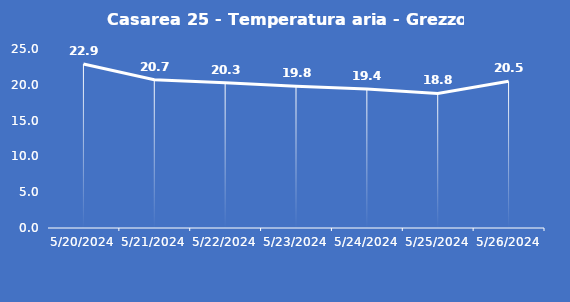
| Category | Casarea 25 - Temperatura aria - Grezzo (°C) |
|---|---|
| 5/20/24 | 22.9 |
| 5/21/24 | 20.7 |
| 5/22/24 | 20.3 |
| 5/23/24 | 19.8 |
| 5/24/24 | 19.4 |
| 5/25/24 | 18.8 |
| 5/26/24 | 20.5 |